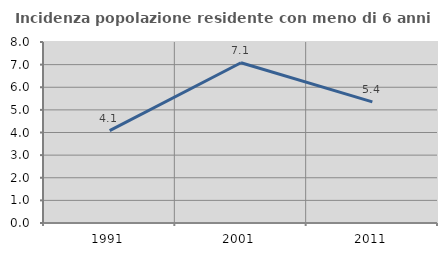
| Category | Incidenza popolazione residente con meno di 6 anni |
|---|---|
| 1991.0 | 4.082 |
| 2001.0 | 7.082 |
| 2011.0 | 5.354 |